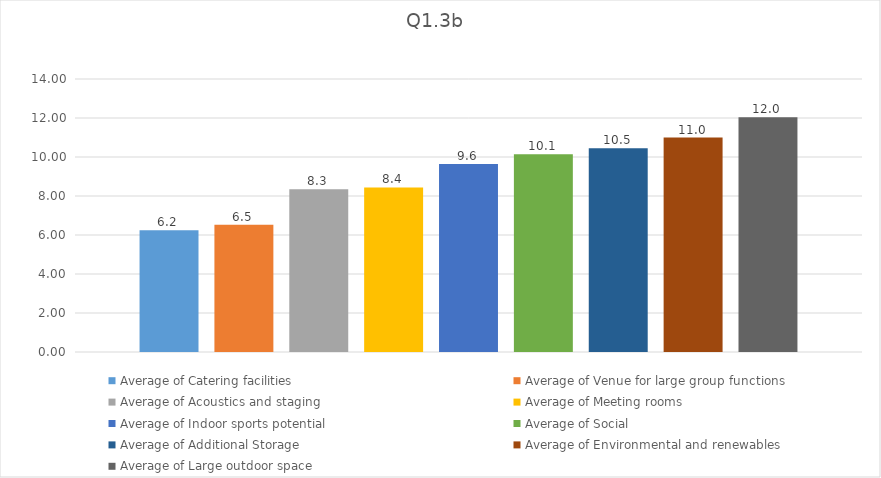
| Category | Average of Catering facilities | Average of Venue for large group functions | Average of Acoustics and staging | Average of Meeting rooms | Average of Indoor sports potential | Average of Social | Average of Additional Storage | Average of Environmental and renewables | Average of Large outdoor space |
|---|---|---|---|---|---|---|---|---|---|
| Total | 6.246 | 6.521 | 8.347 | 8.439 | 9.637 | 10.135 | 10.452 | 10.994 | 12.036 |